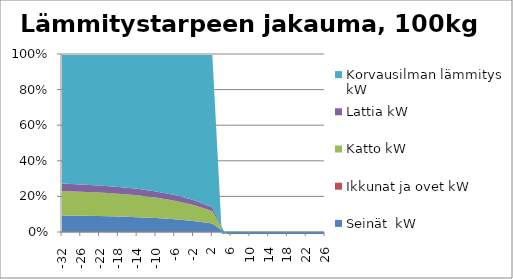
| Category | Seinät  kW | Ikkunat ja ovet kW | Katto kW | Lattia kW | Korvausilman lämmitys kW |
|---|---|---|---|---|---|
| -32.0 | 7.392 | 0 | 10.92 | 3.276 | 57.802 |
| -26.0 | 6.125 | 0 | 9.048 | 2.714 | 49.229 |
| -22.0 | 5.28 | 0 | 7.8 | 2.34 | 43.655 |
| -18.0 | 4.435 | 0 | 6.552 | 1.966 | 38.169 |
| -14.0 | 3.59 | 0 | 5.304 | 1.591 | 32.708 |
| -10.0 | 2.746 | 0 | 4.056 | 1.217 | 27.139 |
| -6.0 | 1.901 | 0 | 2.808 | 0.842 | 21.175 |
| -2.0 | 1.056 | 0 | 1.56 | 0.468 | 14.116 |
| 2.0 | 0.211 | 0 | 0.312 | 0.094 | 3.814 |
| 6.0 | -0.634 | 0 | -0.936 | -0.281 | -20.871 |
| 10.0 | -1.478 | 0 | -2.184 | -0.655 | -7.677 |
| 14.0 | -2.323 | 0 | -3.432 | -1.03 | -12.063 |
| 18.0 | -3.168 | 0 | -4.68 | -1.404 | -16.45 |
| 22.0 | -4.013 | 0 | -5.928 | -1.778 | -20.837 |
| 26.0 | -4.858 | 0 | -7.176 | -2.153 | -25.224 |